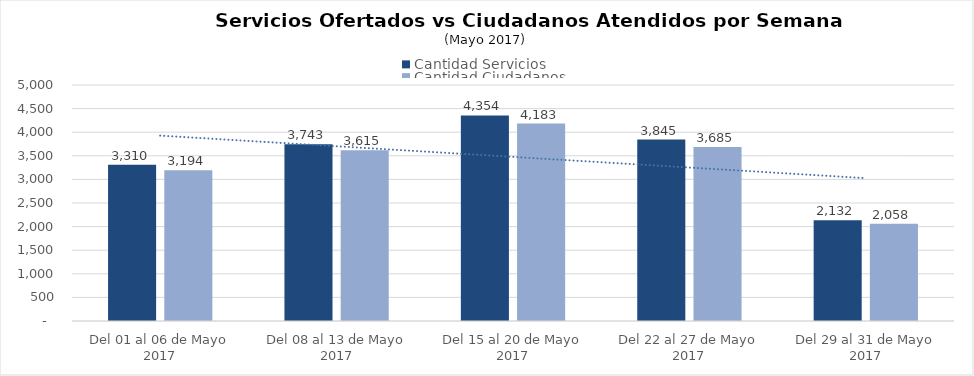
| Category | Cantidad Servicios | Cantidad Ciudadanos |
|---|---|---|
| Del 01 al 06 de Mayo 2017 | 3310 | 3194 |
| Del 08 al 13 de Mayo 2017 | 3743 | 3615 |
| Del 15 al 20 de Mayo 2017 | 4354 | 4183 |
| Del 22 al 27 de Mayo 2017 | 3845 | 3685 |
| Del 29 al 31 de Mayo 2017 | 2132 | 2058 |